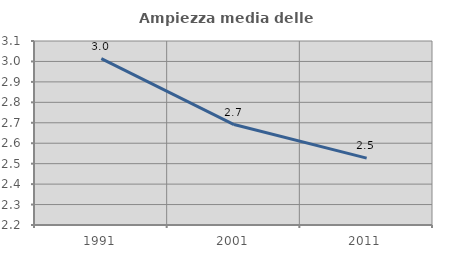
| Category | Ampiezza media delle famiglie |
|---|---|
| 1991.0 | 3.014 |
| 2001.0 | 2.691 |
| 2011.0 | 2.527 |